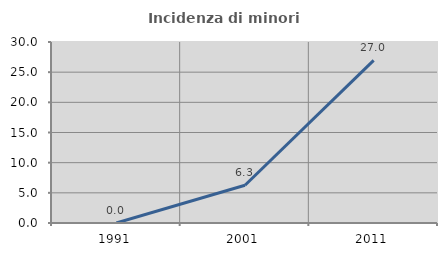
| Category | Incidenza di minori stranieri |
|---|---|
| 1991.0 | 0 |
| 2001.0 | 6.25 |
| 2011.0 | 26.966 |